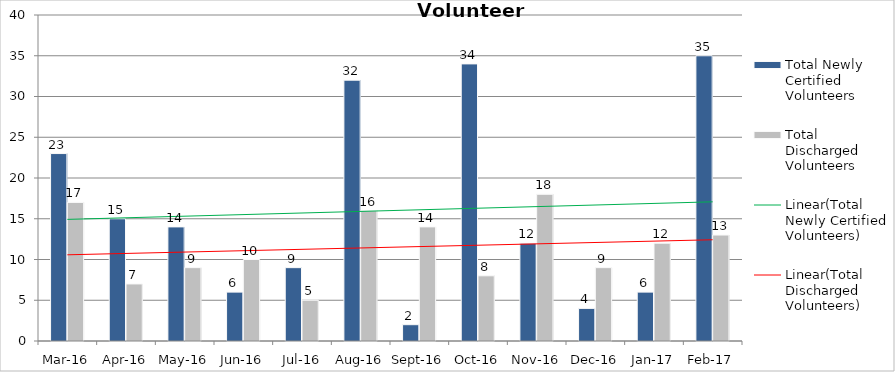
| Category | Total Newly Certified Volunteers | Total Discharged Volunteers |
|---|---|---|
| Mar-16 | 23 | 17 |
| Apr-16 | 15 | 7 |
| May-16 | 14 | 9 |
| Jun-16 | 6 | 10 |
| Jul-16 | 9 | 5 |
| Aug-16 | 32 | 16 |
| Sep-16 | 2 | 14 |
| Oct-16 | 34 | 8 |
| Nov-16 | 12 | 18 |
| Dec-16 | 4 | 9 |
| Jan-17 | 6 | 12 |
| Feb-17 | 35 | 13 |